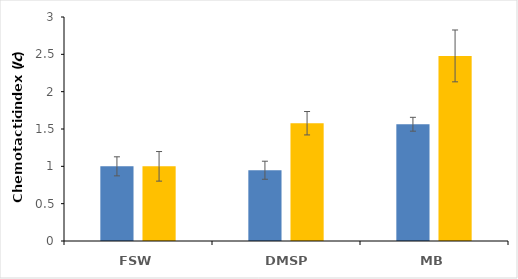
| Category | Series 0 | Series 1 |
|---|---|---|
| FSW | 1 | 1 |
| DMSP | 0.948 | 1.577 |
| MB | 1.564 | 2.479 |